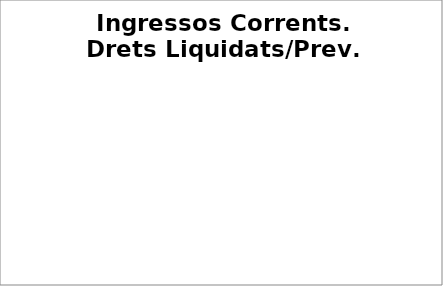
| Category | Series 0 |
|---|---|
| Impostos locals | 0.631 |
| Participació Tributs de l'Estat | 0.688 |
| Taxes i altres ingressos | 0.523 |
| Transferències corrents (exc. FCF) | 0.55 |
| Ingressos patrimonials | 0.419 |
| Ingressos corrents | 0.638 |